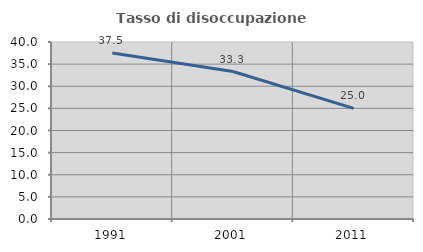
| Category | Tasso di disoccupazione giovanile  |
|---|---|
| 1991.0 | 37.5 |
| 2001.0 | 33.333 |
| 2011.0 | 25 |